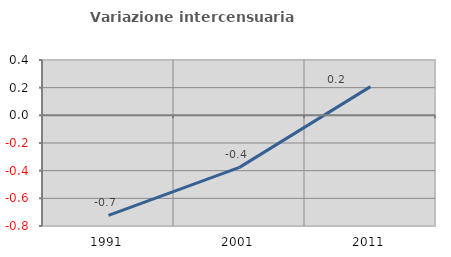
| Category | Variazione intercensuaria annua |
|---|---|
| 1991.0 | -0.723 |
| 2001.0 | -0.376 |
| 2011.0 | 0.207 |